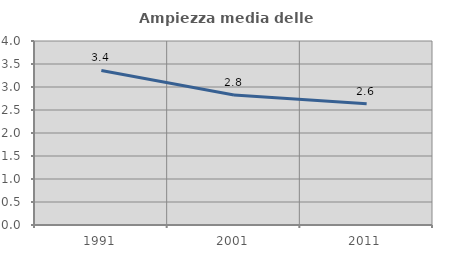
| Category | Ampiezza media delle famiglie |
|---|---|
| 1991.0 | 3.359 |
| 2001.0 | 2.826 |
| 2011.0 | 2.636 |